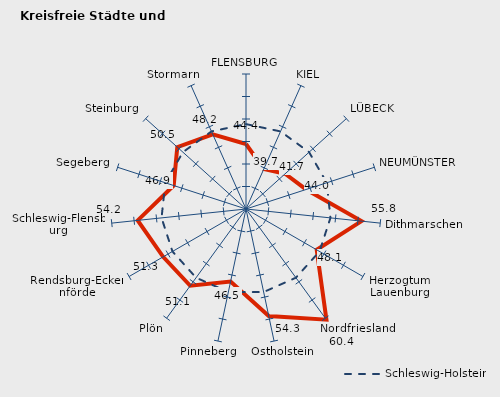
| Category | Kreise | Schleswig-Holstein |
|---|---|---|
| FLENSBURG | 44.447 | 48.868 |
| KIEL | 39.716 | 48.868 |
| LÜBECK | 41.701 | 48.868 |
| NEUMÜNSTER | 44.05 | 48.868 |
| Dithmarschen | 55.8 | 48.868 |
| Herzogtum Lauenburg | 48.142 | 48.868 |
| Nordfriesland | 60.41 | 48.868 |
| Ostholstein | 54.327 | 48.868 |
| Pinneberg | 46.462 | 48.868 |
| Plön | 51.087 | 48.868 |
| Rendsburg-Eckernförde | 51.265 | 48.868 |
| Schleswig-Flensburg | 54.194 | 48.868 |
| Segeberg | 46.894 | 48.868 |
| Steinburg | 50.548 | 48.868 |
| Stormarn | 48.18 | 48.868 |